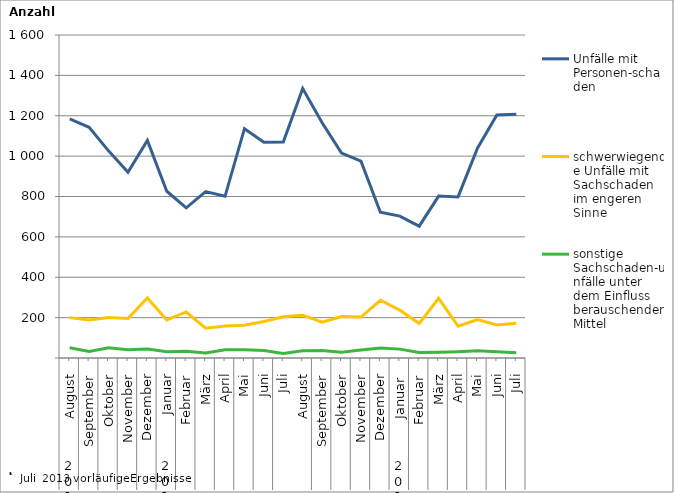
| Category | Unfälle mit Personen-schaden | schwerwiegende Unfälle mit Sachschaden   im engeren Sinne | sonstige Sachschaden-unfälle unter dem Einfluss berauschender Mittel |
|---|---|---|---|
| 0 | 1184 | 200 | 51 |
| 1 | 1143 | 188 | 32 |
| 2 | 1026 | 200 | 51 |
| 3 | 920 | 196 | 41 |
| 4 | 1078 | 297 | 45 |
| 5 | 826 | 188 | 31 |
| 6 | 744 | 228 | 34 |
| 7 | 824 | 148 | 25 |
| 8 | 801 | 159 | 41 |
| 9 | 1136 | 162 | 41 |
| 10 | 1069 | 181 | 37 |
| 11 | 1070 | 204 | 22 |
| 12 | 1335 | 212 | 36 |
| 13 | 1165 | 177 | 37 |
| 14 | 1015 | 205 | 28 |
| 15 | 975 | 203 | 40 |
| 16 | 722 | 286 | 50 |
| 17 | 703 | 237 | 44 |
| 18 | 653 | 171 | 27 |
| 19 | 802 | 296 | 28 |
| 20 | 798 | 158 | 31 |
| 21 | 1039 | 190 | 36 |
| 22 | 1204 | 164 | 31 |
| 23 | 1208 | 172 | 26 |